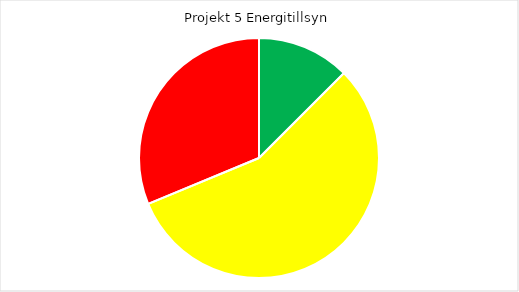
| Category | Series 0 |
|---|---|
| 0 | 2 |
| 1 | 9 |
| 2 | 5 |